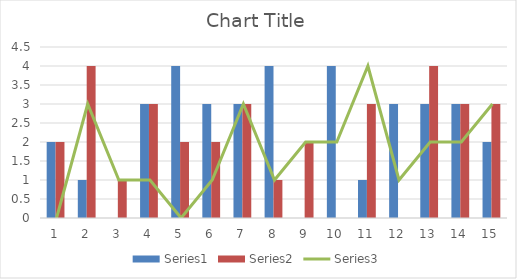
| Category | Series 0 | Series 1 |
|---|---|---|
| 0 | 2 | 2 |
| 1 | 1 | 4 |
| 2 | 0 | 1 |
| 3 | 3 | 3 |
| 4 | 4 | 2 |
| 5 | 3 | 2 |
| 6 | 3 | 3 |
| 7 | 4 | 1 |
| 8 | 0 | 2 |
| 9 | 4 | 0 |
| 10 | 1 | 3 |
| 11 | 3 | 0 |
| 12 | 3 | 4 |
| 13 | 3 | 3 |
| 14 | 2 | 3 |